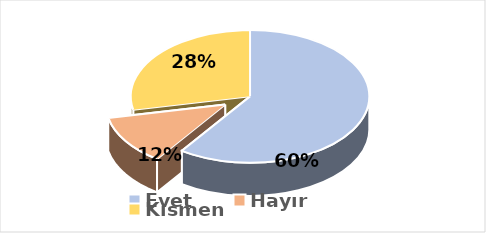
| Category | Evet |
|---|---|
| Evet | 0.597 |
| Hayır | 0.121 |
| Kısmen | 0.282 |